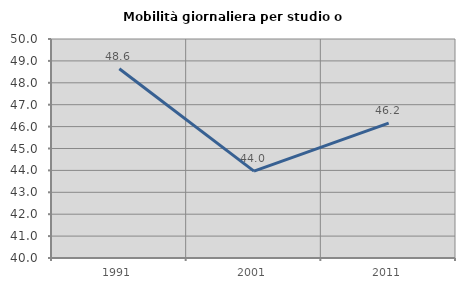
| Category | Mobilità giornaliera per studio o lavoro |
|---|---|
| 1991.0 | 48.64 |
| 2001.0 | 43.965 |
| 2011.0 | 46.156 |